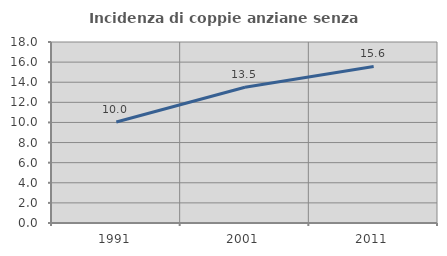
| Category | Incidenza di coppie anziane senza figli  |
|---|---|
| 1991.0 | 10.04 |
| 2001.0 | 13.506 |
| 2011.0 | 15.57 |